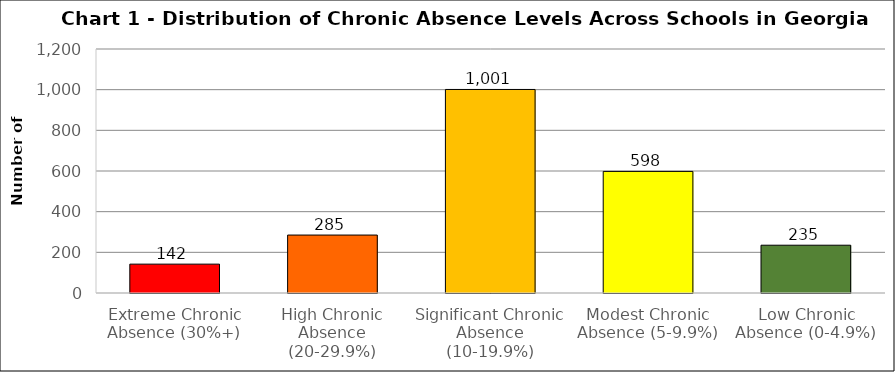
| Category | Series 0 |
|---|---|
| Extreme Chronic Absence (30%+) | 142 |
| High Chronic Absence (20-29.9%) | 285 |
| Significant Chronic Absence (10-19.9%) | 1001 |
| Modest Chronic Absence (5-9.9%) | 598 |
| Low Chronic Absence (0-4.9%) | 235 |